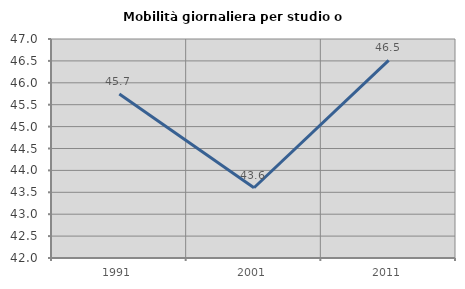
| Category | Mobilità giornaliera per studio o lavoro |
|---|---|
| 1991.0 | 45.742 |
| 2001.0 | 43.603 |
| 2011.0 | 46.512 |